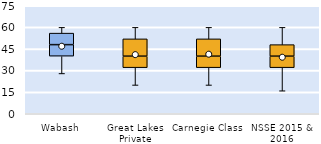
| Category | 25th | 50th | 75th |
|---|---|---|---|
| Wabash | 40 | 8 | 8 |
| Great Lakes Private | 32 | 8 | 12 |
| Carnegie Class | 32 | 8 | 12 |
| NSSE 2015 & 2016 | 32 | 8 | 8 |